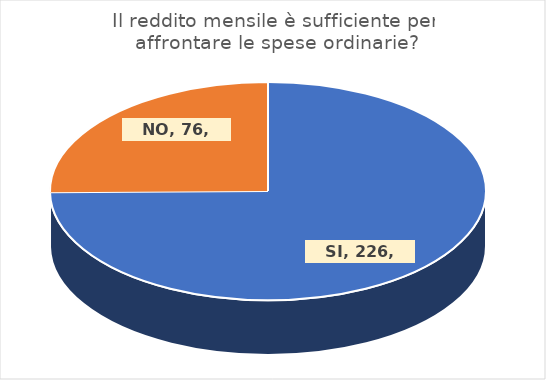
| Category | Series 0 |
|---|---|
| SI | 226 |
| NO | 76 |